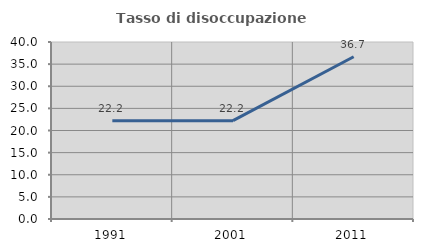
| Category | Tasso di disoccupazione giovanile  |
|---|---|
| 1991.0 | 22.222 |
| 2001.0 | 22.222 |
| 2011.0 | 36.667 |